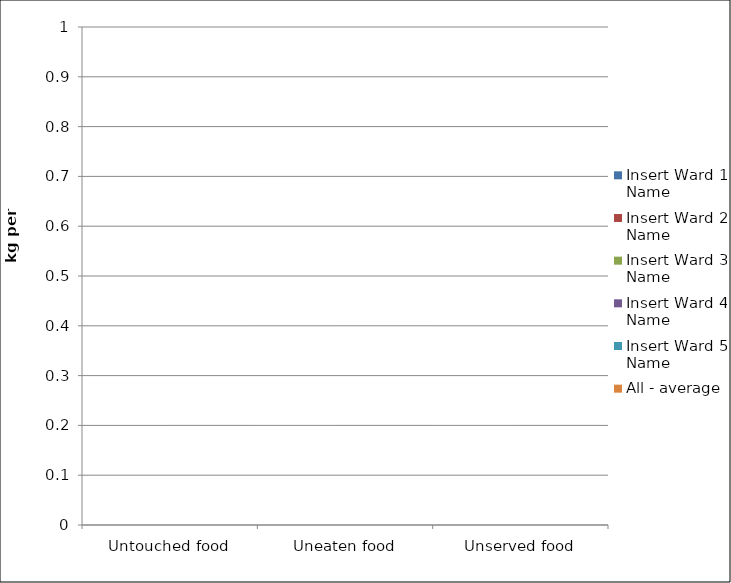
| Category | Insert Ward 1 Name | Insert Ward 2 Name | Insert Ward 3 Name | Insert Ward 4 Name | Insert Ward 5 Name | All - average |
|---|---|---|---|---|---|---|
| Untouched food | 0 | 0 | 0 | 0 | 0 | 0 |
| Uneaten food | 0 | 0 | 0 | 0 | 0 | 0 |
| Unserved food | 0 | 0 | 0 | 0 | 0 | 0 |